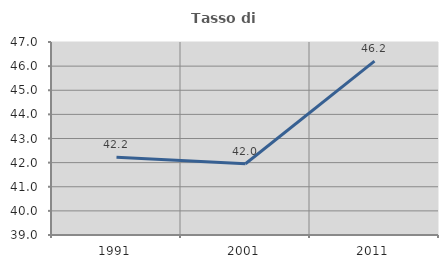
| Category | Tasso di occupazione   |
|---|---|
| 1991.0 | 42.22 |
| 2001.0 | 41.952 |
| 2011.0 | 46.208 |